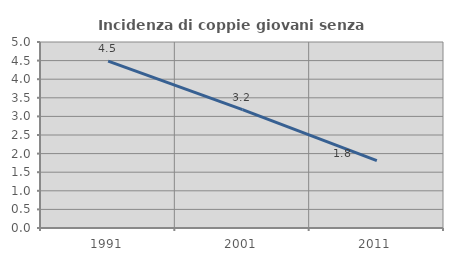
| Category | Incidenza di coppie giovani senza figli |
|---|---|
| 1991.0 | 4.488 |
| 2001.0 | 3.181 |
| 2011.0 | 1.81 |